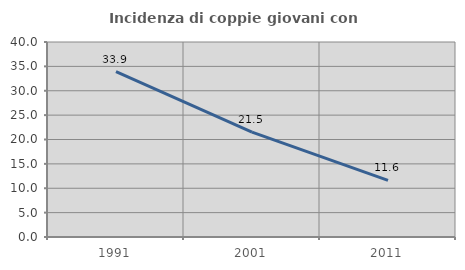
| Category | Incidenza di coppie giovani con figli |
|---|---|
| 1991.0 | 33.898 |
| 2001.0 | 21.514 |
| 2011.0 | 11.6 |